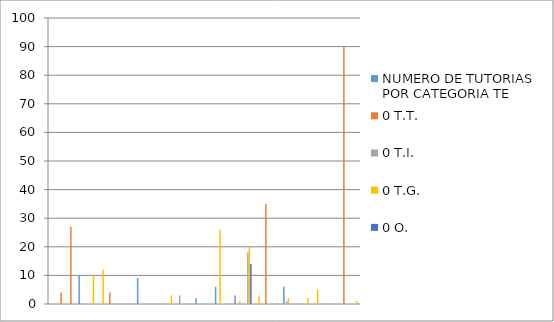
| Category | NUMERO DE TUTORIAS POR CATEGORIA TE | 0 T.T. | 0 T.I. | 0 T.G. | 0 O. |
|---|---|---|---|---|---|
| Alava Faggioni Jorge Arq. | 0 | 0 | 0 | 0 | 0 |
| Anchundia Juan Carlos,Ing. | 0 | 4 | 0 | 0 | 0 |
| Calderon Zamora Marjorie Ing. | 0 | 27 | 0 | 0 | 0 |
| Cano Mure Rodolfo Ec. | 10 | 0 | 0 | 0 | 0 |
| Cedeño  Intriago Rosa Ketty Lcda. | 0 | 0 | 0 | 10 | 0 |
| Cedeño Intriago Raul Ab. | 0 | 0 | 0 | 12 | 0 |
| Cedeño Mejia Francisco Ing. | 0 | 4 | 0 | 0 | 0 |
| Cevallos Alarcon fabricio Lic. | 0 | 0 | 0 | 0 | 0 |
| Cuadro Ocampo Carmina Ec. | 0 | 0 | 0 | 0 | 0 |
| Farfan Triviño Hugo Ernesto Ing. | 9 | 0 | 0 | 0 | 0 |
| Fernandez Alava Vanessa Ing. | 0 | 0 | 0 | 0 | 0 |
| Gresely  Aray  Jorge  Roberth Ec. | 0 | 0 | 0 | 0 | 0 |
| Intriago  Duran Marcos Vinicio Ec. | 0 | 0 | 0 | 3 | 0 |
| Lopez Delgado  Ronal Mauricio  Ing. | 0 | 0 | 3 | 0 | 0 |
| Loor Muñoz Presley Dr. | 0 | 0 | 0 | 0 | 0 |
| Luna Meza Karen Andrea Lcda. | 2 | 0 | 0 | 0 | 0 |
| Marin Rodriguez  Jaime Ab. | 0 | 0 | 0 | 0 | 0 |
| Mendoza Garcia Jorge Gregorio Ing. | 6 | 0 | 0 | 26 | 0 |
| Mendoza Zambrano Mariuxi | 0 | 0 | 0 | 0 | 0 |
| Mendendez Delgado Erick Ing. | 3 | 0 | 0 | 1 | 0 |
| Moreira Garcia Maria Cecilia Lic. | 0 | 0 | 18 | 20 | 14 |
| Palacio Hanze Carlos Luis Ec. | 0 | 0 | 0 | 3 | 0 |
| Parraga Mongrovejo Mayra Ec. | 0 | 35 | 0 | 0 | 0 |
| Rodriguez Rios Elvira Ec. | 0 | 0 | 0 | 0 | 0 |
| Ruperti Cañarte Jenny Ing. | 6 | 0 | 1 | 2 | 0 |
| Sanchez Ramos Fabian Ec. | 0 | 0 | 0 | 0 | 0 |
| Tubay Cedeño Boris Ab. | 0 | 0 | 0 | 2 | 0 |
| Ulloa Almanza Jose  | 0 | 0 | 0 | 5 | 0 |
| Velez Intriago Amnuska Lic. | 0 | 0 | 0 | 0 | 0 |
| Vera Santana Hugo Carlos Ing. | 0 | 0 | 0 | 0 | 0 |
| Zamora Vera Narcisa Ec. | 0 | 90 | 0 | 0 | 0 |
| Claudia Zambrano Yepez,Ing. | 0 | 0 | 0 | 1 | 0 |